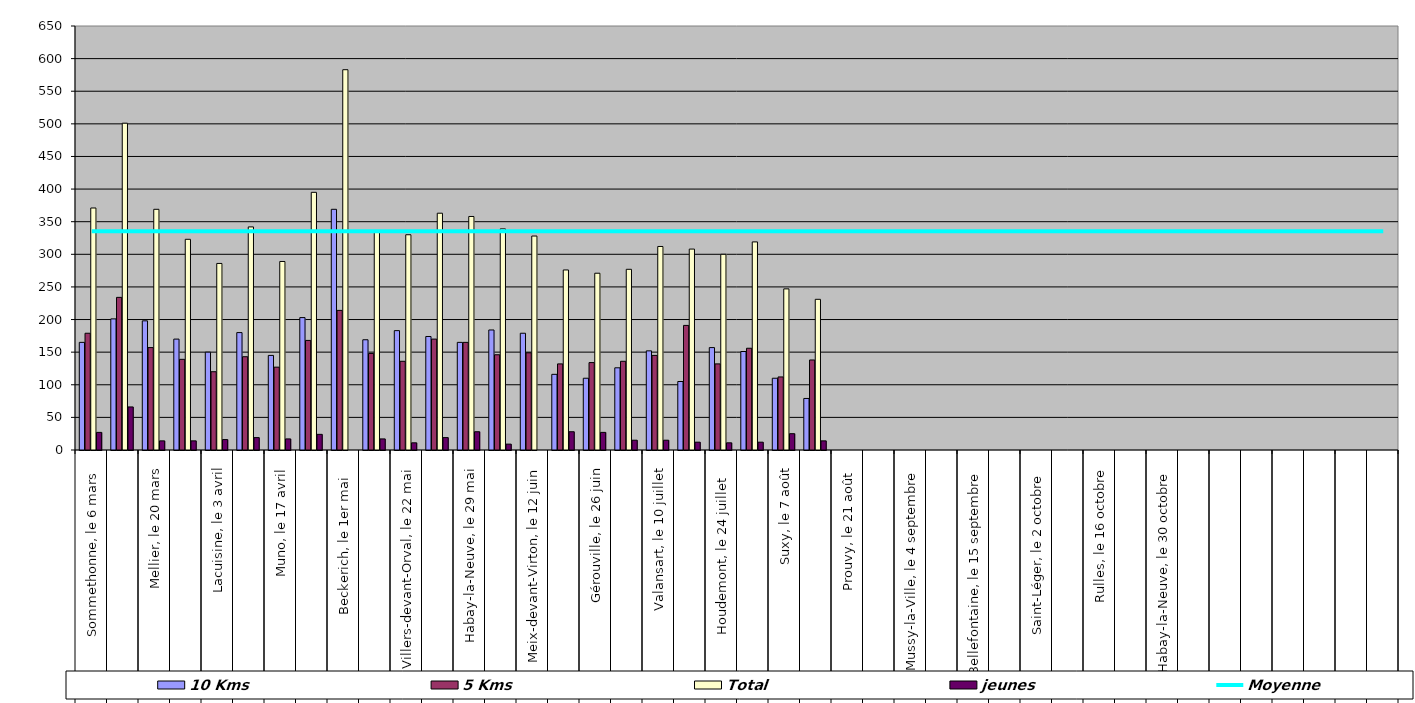
| Category | 10 Kms | 5 Kms | Total | jeunes |
|---|---|---|---|---|
| 0 | 165 | 179 | 371 | 27 |
| 1 | 201 | 234 | 501 | 66 |
| 2 | 198 | 157 | 369 | 14 |
| 3 | 170 | 139 | 323 | 14 |
| 4 | 150 | 120 | 286 | 16 |
| 5 | 180 | 143 | 342 | 19 |
| 6 | 145 | 127 | 289 | 17 |
| 7 | 203 | 168 | 395 | 24 |
| 8 | 369 | 214 | 583 | 0 |
| 9 | 169 | 148 | 334 | 17 |
| 10 | 183 | 136 | 330 | 11 |
| 11 | 174 | 170 | 363 | 19 |
| 12 | 165 | 165 | 358 | 28 |
| 13 | 184 | 146 | 339 | 9 |
| 14 | 179 | 149 | 328 | 0 |
| 15 | 116 | 132 | 276 | 28 |
| 16 | 110 | 134 | 271 | 27 |
| 17 | 126 | 136 | 277 | 15 |
| 18 | 152 | 145 | 312 | 15 |
| 19 | 105 | 191 | 308 | 12 |
| 20 | 157 | 132 | 300 | 11 |
| 21 | 151 | 156 | 319 | 12 |
| 22 | 110 | 112 | 247 | 25 |
| 23 | 79 | 138 | 231 | 14 |
| 24 | 0 | 0 | 0 | 0 |
| 25 | 0 | 0 | 0 | 0 |
| 26 | 0 | 0 | 0 | 0 |
| 27 | 0 | 0 | 0 | 0 |
| 28 | 0 | 0 | 0 | 0 |
| 29 | 0 | 0 | 0 | 0 |
| 30 | 0 | 0 | 0 | 0 |
| 31 | 0 | 0 | 0 | 0 |
| 32 | 0 | 0 | 0 | 0 |
| 33 | 0 | 0 | 0 | 0 |
| 34 | 0 | 0 | 0 | 0 |
| 35 | 0 | 0 | 0 | 0 |
| 36 | 0 | 0 | 0 | 0 |
| 37 | 0 | 0 | 0 | 0 |
| 38 | 0 | 0 | 0 | 0 |
| 39 | 0 | 0 | 0 | 0 |
| 40 | 0 | 0 | 0 | 0 |
| 41 | 0 | 0 | 0 | 0 |